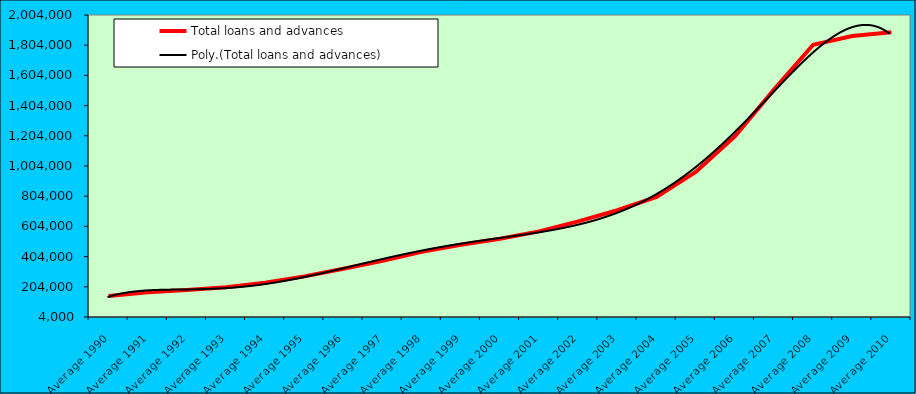
| Category | Total loans and advances |
|---|---|
| Average 1990 | 142836.917 |
| Average 1991 | 167269 |
| Average 1992 | 183192.667 |
| Average 1993 | 201169.417 |
| Average 1994 | 230859.25 |
| Average 1995 | 272838.333 |
| Average 1996 | 323967.417 |
| Average 1997 | 376592 |
| Average 1998 | 435516.5 |
| Average 1999 | 482961 |
| Average 2000 | 522371.583 |
| Average 2001 | 571103.818 |
| Average 2002 | 637028.083 |
| Average 2003 | 710867.083 |
| Average 2004 | 798733.25 |
| Average 2005 | 964176.667 |
| Average 2006 | 1201030.917 |
| Average 2007 | 1509941.167 |
| Average 2008 | 1807369.5 |
| Average 2009 | 1864968.583 |
| Average 2010 | 1890161.111 |